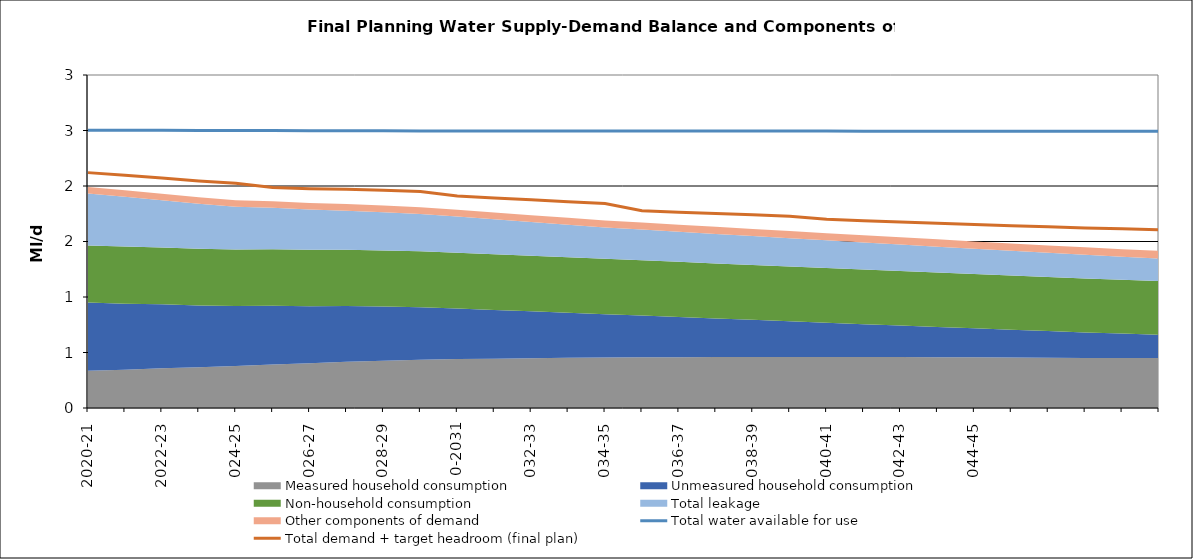
| Category | Total water available for use | Total demand + target headroom (final plan) |
|---|---|---|
| 2020-21 | 2.503 | 2.12 |
| 2021-22 | 2.502 | 2.097 |
| 2022-23 | 2.501 | 2.072 |
| 2023-24 | 2.501 | 2.046 |
| 2024-25 | 2.5 | 2.025 |
| 2025-26 | 2.499 | 1.987 |
| 2026-27 | 2.499 | 1.976 |
| 2027-28 | 2.498 | 1.97 |
| 2028-29 | 2.497 | 1.961 |
| 2029-30 | 2.497 | 1.949 |
| 2030-31 | 2.496 | 1.909 |
| 2031-32 | 2.496 | 1.893 |
| 2032-33 | 2.496 | 1.875 |
| 2033-34 | 2.496 | 1.858 |
| 2034-35 | 2.495 | 1.842 |
| 2035-36 | 2.495 | 1.777 |
| 2036-37 | 2.495 | 1.764 |
| 2037-38 | 2.495 | 1.752 |
| 2038-39 | 2.495 | 1.74 |
| 2039-40 | 2.495 | 1.727 |
| 2040-41 | 2.494 | 1.7 |
| 2041-42 | 2.494 | 1.687 |
| 2042-43 | 2.494 | 1.675 |
| 2043-44 | 2.494 | 1.664 |
| 2044-45 | 2.494 | 1.654 |
| 2045-46 | 2.494 | 1.643 |
| 2046-47 | 2.493 | 1.632 |
| 2047-48 | 2.493 | 1.622 |
| 2048-49 | 2.493 | 1.614 |
| 2049-50 | 2.493 | 1.606 |